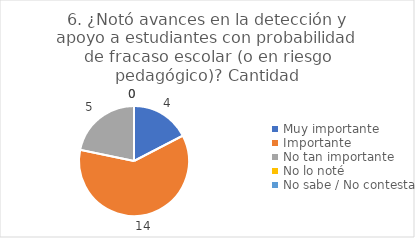
| Category | 6. ¿Notó avances en la detección y apoyo a estudiantes con probabilidad de fracaso escolar (o en riesgo pedagógico)? |
|---|---|
| Muy importante  | 0.174 |
| Importante  | 0.609 |
| No tan importante  | 0.217 |
| No lo noté  | 0 |
| No sabe / No contesta | 0 |